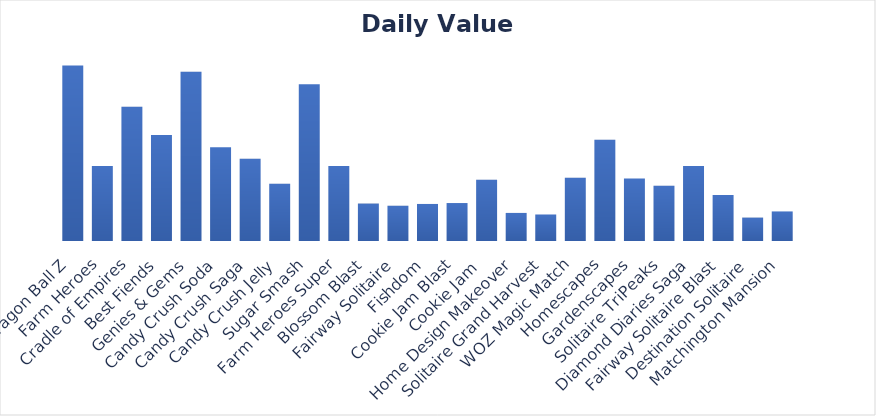
| Category | Daily Value (w/W2E) |
|---|---|
| Dragon Ball Z | 9 |
| Farm Heroes | 3.84 |
| Cradle of Empires | 6.885 |
| Best Fiends | 5.44 |
| Genies & Gems | 8.68 |
| Candy Crush Soda | 4.809 |
| Candy Crush Saga | 4.213 |
| Candy Crush Jelly | 2.933 |
| Sugar Smash | 8.04 |
| Farm Heroes Super | 3.84 |
| Blossom Blast | 1.92 |
| ​​Fairway Solitaire | 1.808 |
| Fishdom | 1.9 |
| Cookie Jam Blast | 1.947 |
| Cookie Jam  | 3.147 |
| Home Design Makeover | 1.44 |
| Solitaire Grand Harvest | 1.36 |
| WOZ Magic Match | 3.247 |
| Homescapes | 5.189 |
| Gardenscapes | 3.21 |
| Solitaire TriPeaks | 2.833 |
| Diamond Diaries Saga | 3.84 |
| ​​Fairway Solitaire Blast | 2.359 |
| Destination Solitaire | 1.2 |
| Matchington Mansion | 1.517 |